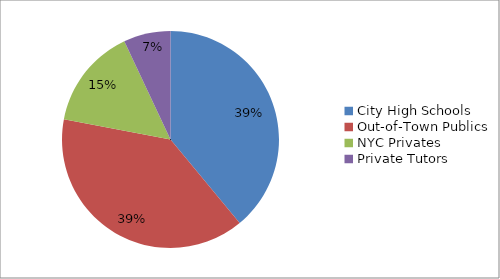
| Category | Series 0 |
|---|---|
| City High Schools | 0.39 |
| Out-of-Town Publics | 0.39 |
| NYC Privates | 0.15 |
| Private Tutors | 0.07 |